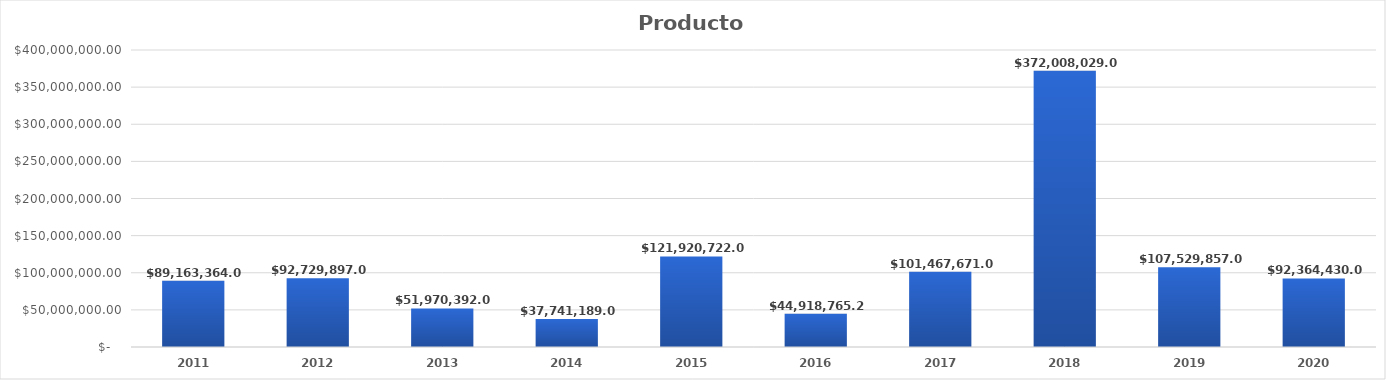
| Category | Productos |
|---|---|
| 2011.0 | 89163364 |
| 2012.0 | 92729897 |
| 2013.0 | 51970392 |
| 2014.0 | 37741189 |
| 2015.0 | 121920722 |
| 2016.0 | 44918765.29 |
| 2017.0 | 101467671 |
| 2018.0 | 372008029 |
| 2019.0 | 107529857 |
| 2020.0 | 92364430 |